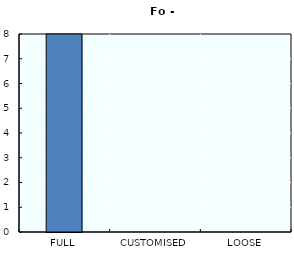
| Category | Series 0 |
|---|---|
| FULL | 8 |
| CUSTOMISED | 0 |
| LOOSE | 0 |